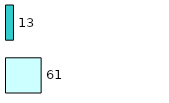
| Category | Series 0 | Series 1 |
|---|---|---|
| 0 | 61 | 13 |